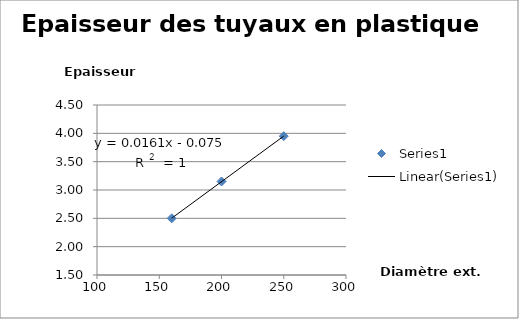
| Category | Series 0 |
|---|---|
| 160.0 | 2.5 |
| 200.0 | 3.15 |
| 250.0 | 3.95 |